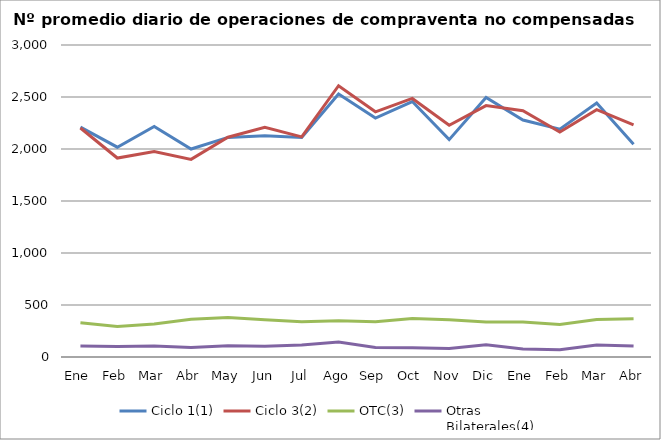
| Category | Ciclo 1(1) | Ciclo 3(2) | OTC(3) | Otras
Bilaterales(4) |
|---|---|---|---|---|
| Ene | 2210.19 | 2201.571 | 328.762 | 106.667 |
| Feb | 2017.45 | 1913.15 | 292.55 | 100.15 |
| Mar | 2215.783 | 1975.174 | 318 | 106.957 |
| Abr | 2000 | 1899.95 | 362.95 | 91.15 |
| May | 2111.591 | 2113.045 | 380.636 | 107.182 |
| Jun | 2126.714 | 2208.381 | 357.714 | 102.476 |
| Jul | 2110 | 2116.476 | 339.571 | 116.524 |
| Ago | 2528.364 | 2608.273 | 349.727 | 144.909 |
| Sep | 2297.381 | 2357.81 | 339.571 | 92.238 |
| Oct | 2456.053 | 2486.211 | 370.263 | 88.368 |
| Nov | 2089.905 | 2227.762 | 359.143 | 80.952 |
| Dic | 2496 | 2417.381 | 337.238 | 117.762 |
| Ene | 2278.636 | 2368.091 | 335.864 | 75.864 |
| Feb | 2191.19 | 2162.381 | 312.524 | 70.524 |
| Mar | 2441.909 | 2378.273 | 359.818 | 115.591 |
| Abr | 2044.9 | 2232.05 | 368.5 | 105.9 |